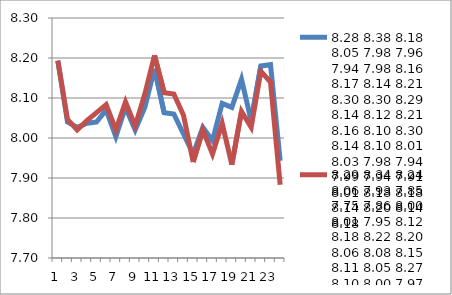
| Category | 8.28 8.38 8.18 8.05 7.98 7.96 7.94 7.98 8.16 8.17 8.14 8.21 8.30 8.30 8.29 8.14 8.12 8.21 8.16 8.10 8.30 8.14 8.10 8.01 8.03 7.98 7.94 7.99 7.94 7.91 8.01 8.18 8.18 8.14 8.20 8.14 8.18 | 8.29 8.34 8.24 8.06 7.93 7.85 7.75 7.86 8.00 8.01 7.95 8.12 8.18 8.22 8.20 8.06 8.08 8.15 8.11 8.05 8.27 8.10 8.00 7.97 7.97 7.95 7.85 7.95 7.94 7.89 8.02 8.22 8.20 8.16 8.20 8.08 8.18 |
|---|---|---|
| 0 | 8.193 | 8.193 |
| 1 | 8.04 | 8.047 |
| 2 | 8.027 | 8.02 |
| 3 | 8.037 | 8.043 |
| 4 | 8.04 | 8.063 |
| 5 | 8.07 | 8.083 |
| 6 | 8.003 | 8.02 |
| 7 | 8.077 | 8.09 |
| 8 | 8.02 | 8.03 |
| 9 | 8.077 | 8.11 |
| 10 | 8.173 | 8.207 |
| 11 | 8.063 | 8.113 |
| 12 | 8.06 | 8.11 |
| 13 | 8.01 | 8.057 |
| 14 | 7.96 | 7.94 |
| 15 | 8.027 | 8.02 |
| 16 | 7.993 | 7.96 |
| 17 | 8.087 | 8.037 |
| 18 | 8.077 | 7.933 |
| 19 | 8.147 | 8.067 |
| 20 | 8.043 | 8.027 |
| 21 | 8.18 | 8.167 |
| 22 | 8.183 | 8.14 |
| 23 | 7.943 | 7.883 |